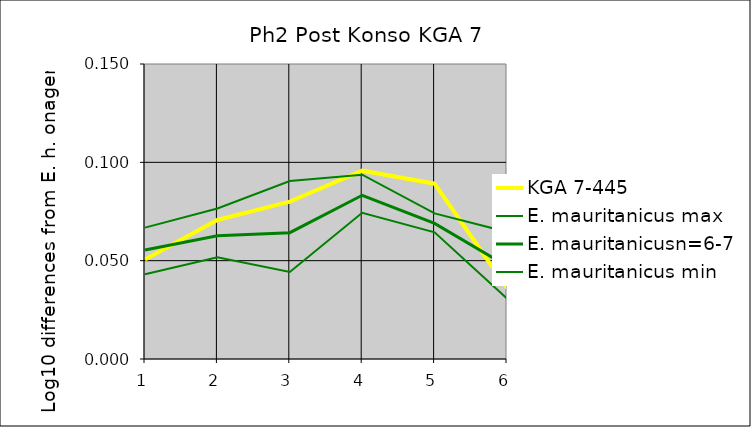
| Category | KGA 7-445 | E. mauritanicus max | E. mauritanicusn=6-7 | E. mauritanicus min |
|---|---|---|---|---|
| 1.0 | 0.051 | 0.043 | 0.055 | 0.067 |
| 2.0 | 0.071 | 0.052 | 0.063 | 0.077 |
| 3.0 | 0.08 | 0.044 | 0.064 | 0.09 |
| 4.0 | 0.096 | 0.074 | 0.083 | 0.094 |
| 5.0 | 0.089 | 0.064 | 0.069 | 0.074 |
| 6.0 | 0.036 | 0.031 | 0.047 | 0.065 |